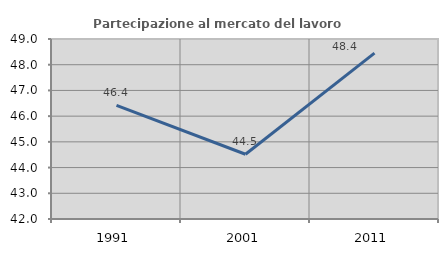
| Category | Partecipazione al mercato del lavoro  femminile |
|---|---|
| 1991.0 | 46.42 |
| 2001.0 | 44.518 |
| 2011.0 | 48.45 |